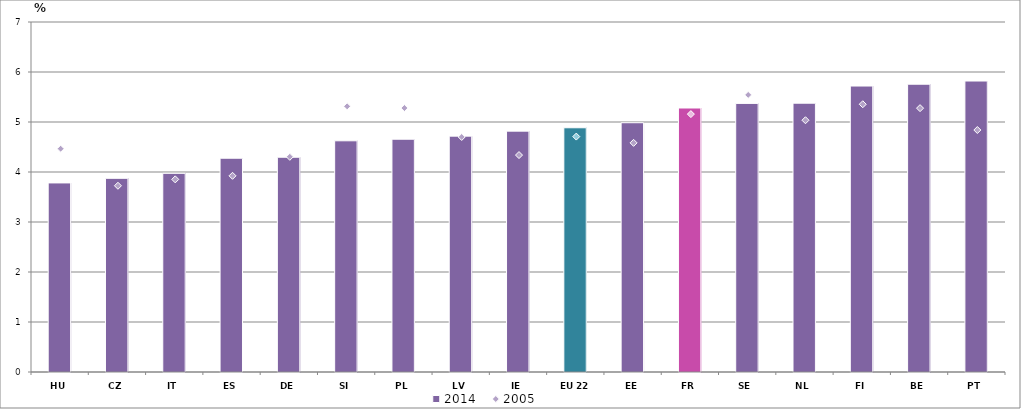
| Category | 2014 |
|---|---|
| HU | 3.781 |
| CZ | 3.874 |
| IT | 3.974 |
| ES | 4.276 |
| DE | 4.295 |
| SI | 4.624 |
| PL | 4.655 |
| LV | 4.717 |
| IE | 4.817 |
| EU 22 | 4.885 |
| EE | 4.985 |
| FR | 5.28 |
| SE | 5.372 |
| NL | 5.376 |
| FI | 5.719 |
| BE | 5.756 |
| PT | 5.819 |